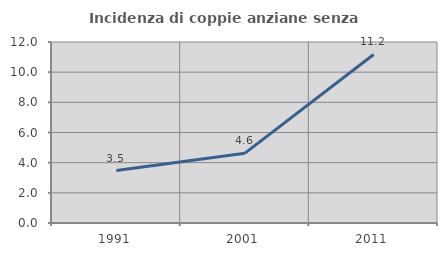
| Category | Incidenza di coppie anziane senza figli  |
|---|---|
| 1991.0 | 3.475 |
| 2001.0 | 4.63 |
| 2011.0 | 11.172 |